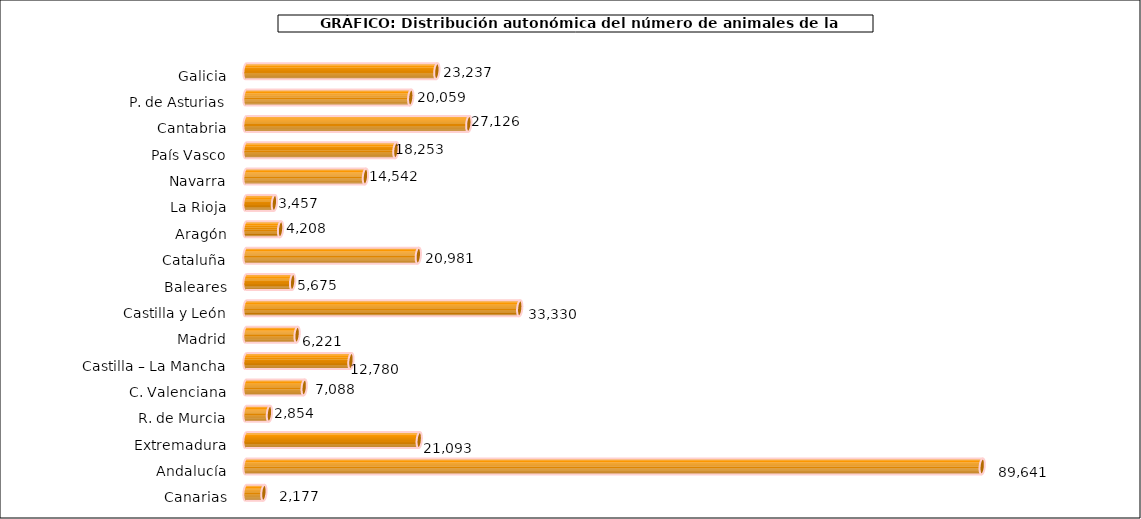
| Category | num. Animales |
|---|---|
| 0 | 23237 |
| 1 | 20059 |
| 2 | 27126 |
| 3 | 18253 |
| 4 | 14542 |
| 5 | 3457 |
| 6 | 4208 |
| 7 | 20981 |
| 8 | 5675 |
| 9 | 33330 |
| 10 | 6221 |
| 11 | 12780 |
| 12 | 7088 |
| 13 | 2854 |
| 14 | 21093 |
| 15 | 89641 |
| 16 | 2177 |